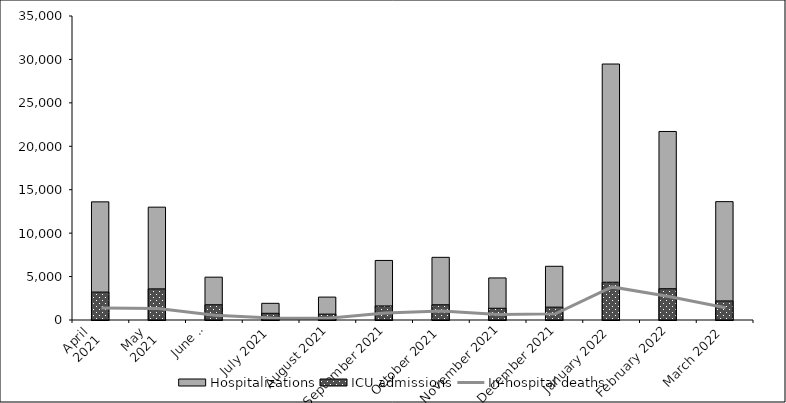
| Category | Hospitalizations | ICU admissions |
|---|---|---|
| April 
2021 | 13603 | 3217 |
| May 
2021 | 12991 | 3587 |
| June 
2021 | 4931 | 1755 |
| July 2021 | 1921 | 773 |
| August 2021 | 2639 | 678 |
| September 2021 | 6857 | 1619 |
| October 2021 | 7215 | 1754 |
| November 2021 | 4841 | 1352 |
| December 2021 | 6184 | 1481 |
| January 2022 | 29471 | 4350 |
| February 2022 | 21705 | 3605 |
| March 2022 | 13628 | 2200 |